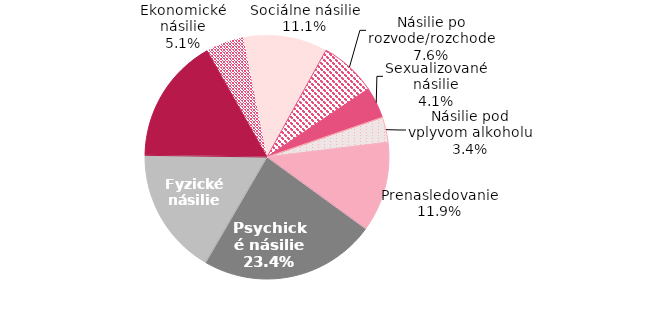
| Category | Series 0 |
|---|---|
| Psychické násilie | 0.234 |
| Fyzické násilie | 0.168 |
| Nebezpečné vyhrážanie | 0.166 |
| Ekonomické násilie | 0.051 |
| Sociálne násilie | 0.111 |
| Násilie po rozvode/rozchode | 0.076 |
| Sexualizované násilie | 0.041 |
| Násilie pod vplyvom alkoholu  | 0.034 |
| Prenasledovanie | 0.119 |